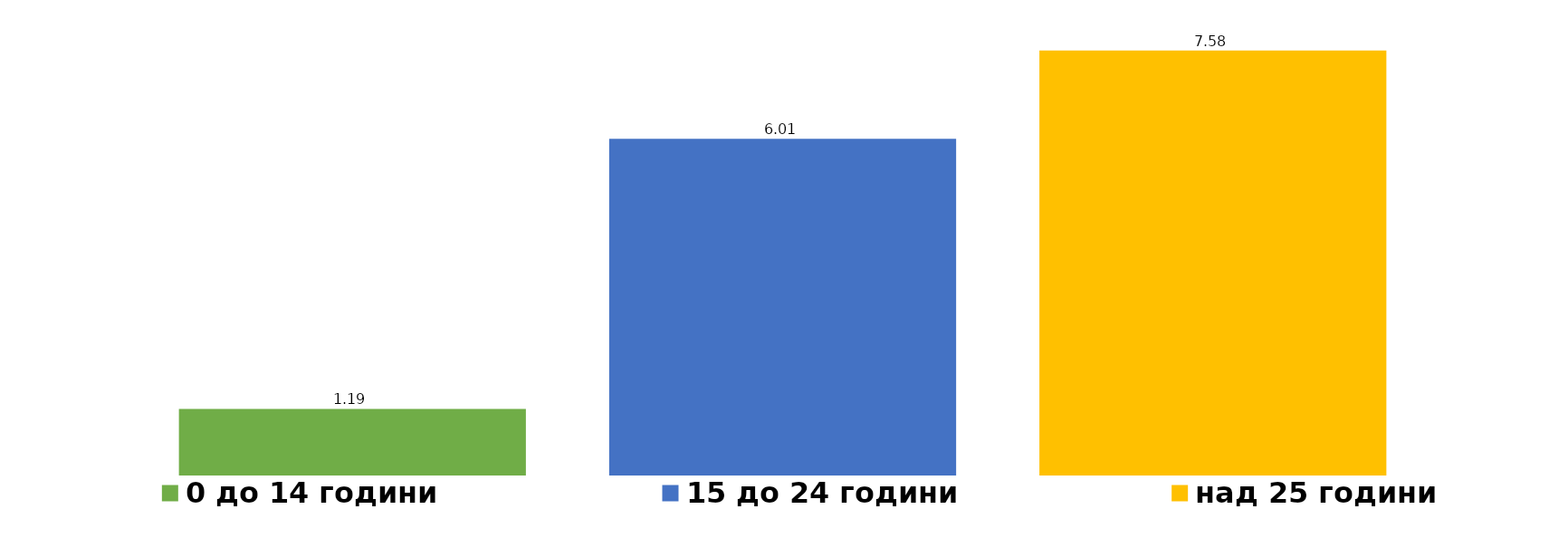
| Category | 0 до 14 години  | 15 до 24 години | над 25 години |
|---|---|---|---|
| 2019.0 | 1.188 | 6.007 | 7.584 |